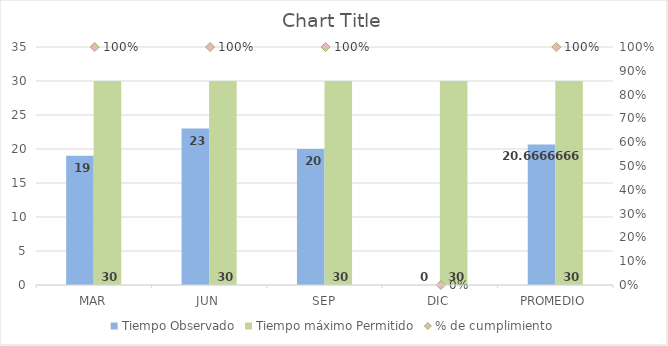
| Category | Tiempo Observado | Tiempo máximo Permitido |
|---|---|---|
| MAR | 19 | 30 |
| JUN | 23 | 30 |
| SEP | 20 | 30 |
| DIC | 0 | 30 |
| PROMEDIO | 20.667 | 30 |